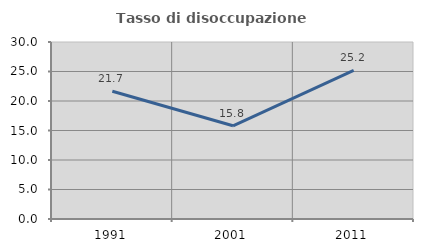
| Category | Tasso di disoccupazione giovanile  |
|---|---|
| 1991.0 | 21.664 |
| 2001.0 | 15.797 |
| 2011.0 | 25.2 |